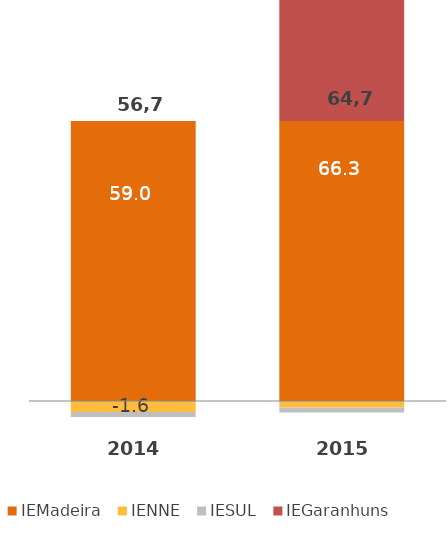
| Category | IEMadeira | IENNE | IESUL | IEGaranhuns |
|---|---|---|---|---|
| 
2014 | 59.012 | -1.568 | -0.707 | 0 |
| 
2015 | 66.314 | -0.925 | -0.721 | 1.755 |